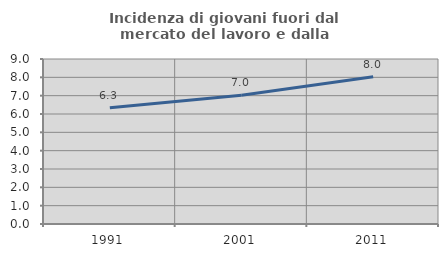
| Category | Incidenza di giovani fuori dal mercato del lavoro e dalla formazione  |
|---|---|
| 1991.0 | 6.344 |
| 2001.0 | 7.025 |
| 2011.0 | 8.037 |